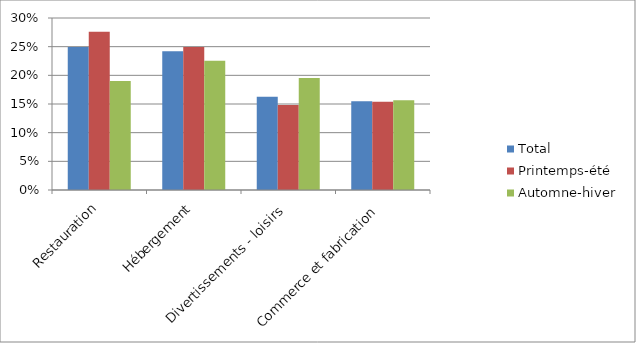
| Category | Total | Printemps-été | Automne-hiver |
|---|---|---|---|
| Restauration | 0.25 | 0.276 | 0.19 |
| Hébergement | 0.242 | 0.249 | 0.225 |
| Divertissements - loisirs | 0.163 | 0.148 | 0.195 |
| Commerce et fabrication | 0.155 | 0.154 | 0.157 |